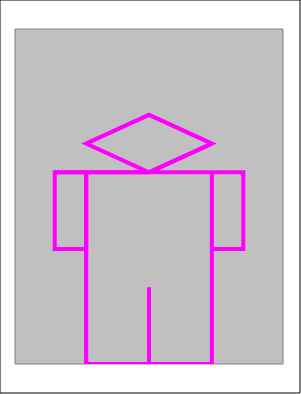
| Category | Actual |
|---|---|
| 0.0 | 0 |
| 2.345787061310928 | 0 |
| 2.345787061310928 | 8.583 |
| 3.518680591966392 | 8.583 |
| 3.518680591966392 | 5.15 |
| 2.345787061310928 | 5.15 |
| 2.345787061310928 | 8.583 |
| 0.0 | 8.583 |
| 2.345787061310928 | 9.87 |
| 0.0 | 11.158 |
| -2.345787061310928 | 9.87 |
| 0.0 | 8.583 |
| -3.518680591966392 | 8.583 |
| -3.518680591966392 | 5.15 |
| -2.345787061310928 | 5.15 |
| -2.345787061310928 | 8.583 |
| -2.345787061310928 | 0 |
| 0.0 | 0 |
| 0.0 | 3.433 |